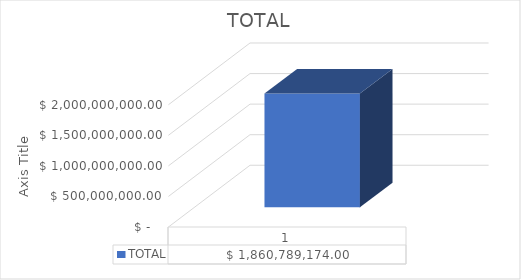
| Category |  TOTAL  |
|---|---|
| 0 | 1860789174 |